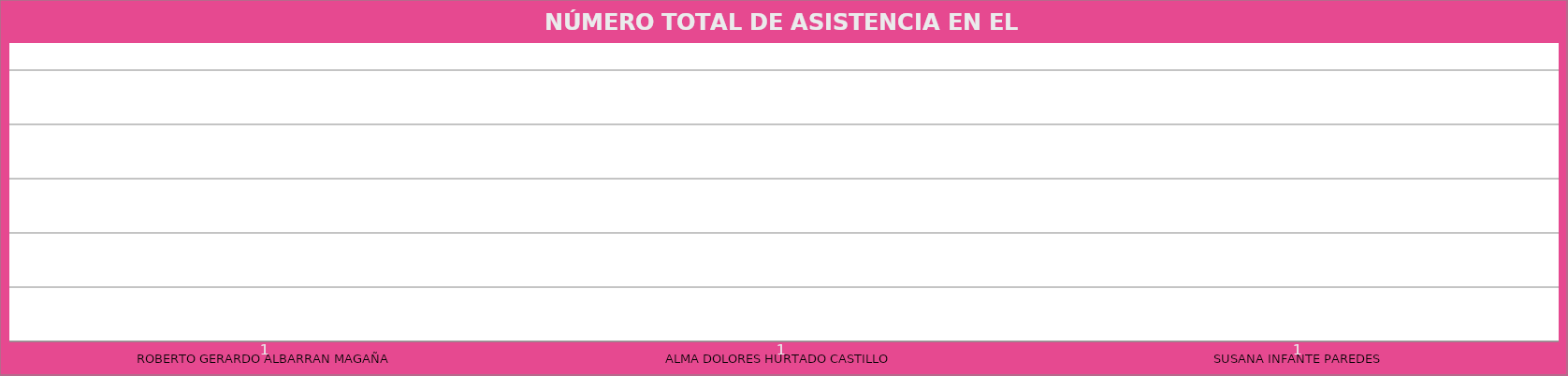
| Category | ROBERTO GERARDO ALBARRAN MAGAÑA |
|---|---|
| ROBERTO GERARDO ALBARRAN MAGAÑA | 1 |
| ALMA DOLORES HURTADO CASTILLO  | 1 |
| SUSANA INFANTE PAREDES | 1 |